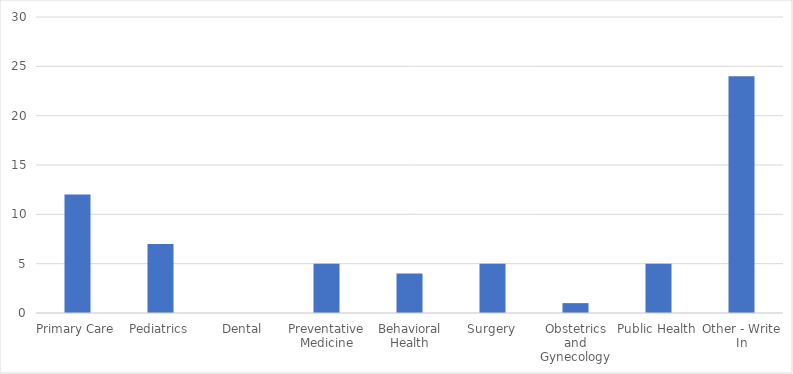
| Category | Number of Responses |
|---|---|
| Primary Care | 12 |
| Pediatrics | 7 |
| Dental | 0 |
| Preventative Medicine | 5 |
| Behavioral Health | 4 |
| Surgery | 5 |
| Obstetrics and Gynecology | 1 |
| Public Health | 5 |
| Other - Write In | 24 |